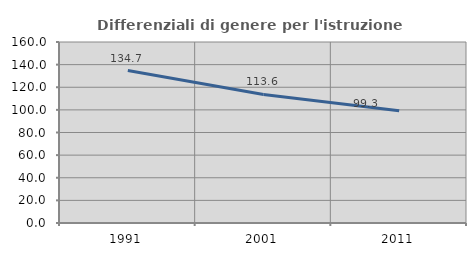
| Category | Differenziali di genere per l'istruzione superiore |
|---|---|
| 1991.0 | 134.724 |
| 2001.0 | 113.624 |
| 2011.0 | 99.292 |